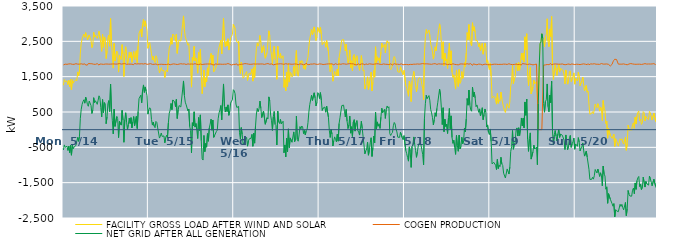
| Category | FACILITY GROSS LOAD AFTER WIND AND SOLAR | COGEN PRODUCTION | NET GRID AFTER ALL GENERATION |
|---|---|---|---|
|  Mon  5/14 | 1258 | 1832 | -574 |
|  Mon  5/14 | 1418 | 1849 | -431 |
|  Mon  5/14 | 1354 | 1854 | -500 |
|  Mon  5/14 | 1352 | 1835 | -483 |
|  Mon  5/14 | 1381 | 1849 | -468 |
|  Mon  5/14 | 1278 | 1864 | -586 |
|  Mon  5/14 | 1394 | 1860 | -466 |
|  Mon  5/14 | 1210 | 1861 | -651 |
|  Mon  5/14 | 1420 | 1863 | -443 |
|  Mon  5/14 | 1128 | 1851 | -723 |
|  Mon  5/14 | 1414 | 1850 | -436 |
|  Mon  5/14 | 1317 | 1854 | -537 |
|  Mon  5/14 | 1361 | 1849 | -488 |
|  Mon  5/14 | 1387 | 1853 | -466 |
|  Mon  5/14 | 1418 | 1867 | -449 |
|  Mon  5/14 | 1382 | 1848 | -466 |
|  Mon  5/14 | 1634 | 1855 | -221 |
|  Mon  5/14 | 1527 | 1856 | -329 |
|  Mon  5/14 | 1658 | 1854 | -196 |
|  Mon  5/14 | 2163 | 1841 | 322 |
|  Mon  5/14 | 2440 | 1864 | 576 |
|  Mon  5/14 | 2573 | 1856 | 717 |
|  Mon  5/14 | 2648 | 1851 | 797 |
|  Mon  5/14 | 2704 | 1858 | 846 |
|  Mon  5/14 | 2612 | 1863 | 749 |
|  Mon  5/14 | 2748 | 1829 | 919 |
|  Mon  5/14 | 2683 | 1849 | 834 |
|  Mon  5/14 | 2538 | 1829 | 709 |
|  Mon  5/14 | 2535 | 1873 | 662 |
|  Mon  5/14 | 2680 | 1870 | 810 |
|  Mon  5/14 | 2660 | 1867 | 793 |
|  Mon  5/14 | 2529 | 1844 | 685 |
|  Mon  5/14 | 2323 | 1865 | 458 |
|  Mon  5/14 | 2403 | 1849 | 554 |
|  Mon  5/14 | 2757 | 1852 | 905 |
|  Mon  5/14 | 2620 | 1854 | 766 |
|  Mon  5/14 | 2667 | 1849 | 818 |
|  Mon  5/14 | 2661 | 1835 | 826 |
|  Mon  5/14 | 2586 | 1869 | 717 |
|  Mon  5/14 | 2674 | 1842 | 832 |
|  Mon  5/14 | 2785 | 1827 | 958 |
|  Mon  5/14 | 2759 | 1858 | 901 |
|  Mon  5/14 | 2479 | 1850 | 629 |
|  Mon  5/14 | 2216 | 1855 | 361 |
|  Mon  5/14 | 2700 | 1847 | 853 |
|  Mon  5/14 | 2331 | 1848 | 483 |
|  Mon  5/14 | 2627 | 1859 | 768 |
|  Mon  5/14 | 2584 | 1857 | 727 |
|  Mon  5/14 | 2014 | 1845 | 169 |
|  Mon  5/14 | 2221 | 1858 | 363 |
|  Mon  5/14 | 2592 | 1859 | 733 |
|  Mon  5/14 | 2677 | 1854 | 823 |
|  Mon  5/14 | 2364 | 1849 | 515 |
|  Mon  5/14 | 3144 | 1855 | 1289 |
|  Mon  5/14 | 2431 | 1865 | 566 |
|  Mon  5/14 | 2110 | 1859 | 251 |
|  Mon  5/14 | 1743 | 1862 | -119 |
|  Mon  5/14 | 2438 | 1860 | 578 |
|  Mon  5/14 | 1942 | 1850 | 92 |
|  Mon  5/14 | 1953 | 1855 | 98 |
|  Mon  5/14 | 2224 | 1852 | 372 |
|  Mon  5/14 | 2172 | 1859 | 313 |
|  Mon  5/14 | 1629 | 1854 | -225 |
|  Mon  5/14 | 2107 | 1871 | 236 |
|  Mon  5/14 | 2078 | 1849 | 229 |
|  Mon  5/14 | 1984 | 1855 | 129 |
|  Mon  5/14 | 2406 | 1860 | 546 |
|  Mon  5/14 | 2131 | 1863 | 268 |
|  Mon  5/14 | 1505 | 1862 | -357 |
|  Mon  5/14 | 2153 | 1870 | 283 |
|  Mon  5/14 | 2346 | 1868 | 478 |
|  Mon  5/14 | 2058 | 1849 | 209 |
|  Mon  5/14 | 1856 | 1856 | 0 |
|  Mon  5/14 | 2003 | 1855 | 148 |
|  Mon  5/14 | 2192 | 1867 | 325 |
|  Mon  5/14 | 2029 | 1854 | 175 |
|  Mon  5/14 | 2195 | 1855 | 340 |
|  Mon  5/14 | 1905 | 1854 | 51 |
|  Mon  5/14 | 2080 | 1860 | 220 |
|  Mon  5/14 | 2211 | 1839 | 372 |
|  Mon  5/14 | 1985 | 1873 | 112 |
|  Mon  5/14 | 1983 | 1853 | 130 |
|  Mon  5/14 | 2234 | 1859 | 375 |
|  Mon  5/14 | 1899 | 1867 | 32 |
|  Mon  5/14 | 2380 | 1864 | 516 |
|  Mon  5/14 | 2730 | 1852 | 878 |
|  Mon  5/14 | 2737 | 1860 | 877 |
|  Mon  5/14 | 2846 | 1871 | 975 |
|  Mon  5/14 | 2626 | 1866 | 760 |
|  Mon  5/14 | 2975 | 1855 | 1120 |
|  Mon  5/14 | 3124 | 1858 | 1266 |
|  Mon  5/14 | 2917 | 1863 | 1054 |
|  Mon  5/14 | 3079 | 1870 | 1209 |
|  Mon  5/14 | 2937 | 1851 | 1086 |
|  Mon  5/14 | 2810 | 1849 | 961 |
|  Mon  5/14 | 2303 | 1864 | 439 |
|  Tue  5/15 | 2420 | 1857 | 563 |
|  Tue  5/15 | 2468 | 1848 | 620 |
|  Tue  5/15 | 2459 | 1869 | 590 |
|  Tue  5/15 | 2158 | 1870 | 288 |
|  Tue  5/15 | 1977 | 1847 | 130 |
|  Tue  5/15 | 2081 | 1868 | 213 |
|  Tue  5/15 | 1952 | 1850 | 102 |
|  Tue  5/15 | 1899 | 1843 | 56 |
|  Tue  5/15 | 2092 | 1859 | 233 |
|  Tue  5/15 | 2037 | 1833 | 204 |
|  Tue  5/15 | 1885 | 1836 | 49 |
|  Tue  5/15 | 1913 | 1862 | 51 |
|  Tue  5/15 | 1610 | 1848 | -238 |
|  Tue  5/15 | 1670 | 1854 | -184 |
|  Tue  5/15 | 1758 | 1852 | -94 |
|  Tue  5/15 | 1669 | 1861 | -192 |
|  Tue  5/15 | 1676 | 1847 | -171 |
|  Tue  5/15 | 1676 | 1853 | -177 |
|  Tue  5/15 | 1474 | 1846 | -372 |
|  Tue  5/15 | 1646 | 1870 | -224 |
|  Tue  5/15 | 1688 | 1844 | -156 |
|  Tue  5/15 | 1635 | 1866 | -231 |
|  Tue  5/15 | 2049 | 1858 | 191 |
|  Tue  5/15 | 2319 | 1852 | 467 |
|  Tue  5/15 | 2389 | 1836 | 553 |
|  Tue  5/15 | 2604 | 1862 | 742 |
|  Tue  5/15 | 2418 | 1852 | 566 |
|  Tue  5/15 | 2706 | 1865 | 841 |
|  Tue  5/15 | 2691 | 1862 | 829 |
|  Tue  5/15 | 2648 | 1858 | 790 |
|  Tue  5/15 | 2504 | 1853 | 651 |
|  Tue  5/15 | 2703 | 1844 | 859 |
|  Tue  5/15 | 2160 | 1844 | 316 |
|  Tue  5/15 | 2410 | 1853 | 557 |
|  Tue  5/15 | 2538 | 1855 | 683 |
|  Tue  5/15 | 2546 | 1855 | 691 |
|  Tue  5/15 | 2509 | 1866 | 643 |
|  Tue  5/15 | 2514 | 1863 | 651 |
|  Tue  5/15 | 2982 | 1858 | 1124 |
|  Tue  5/15 | 3220 | 1841 | 1379 |
|  Tue  5/15 | 2831 | 1862 | 969 |
|  Tue  5/15 | 2636 | 1858 | 778 |
|  Tue  5/15 | 2549 | 1845 | 704 |
|  Tue  5/15 | 2571 | 1852 | 719 |
|  Tue  5/15 | 2391 | 1861 | 530 |
|  Tue  5/15 | 2436 | 1851 | 585 |
|  Tue  5/15 | 1938 | 1853 | 85 |
|  Tue  5/15 | 1836 | 1860 | -24 |
|  Tue  5/15 | 1204 | 1859 | -655 |
|  Tue  5/15 | 2049 | 1852 | 197 |
|  Tue  5/15 | 1963 | 1853 | 110 |
|  Tue  5/15 | 2357 | 1851 | 506 |
|  Tue  5/15 | 1941 | 1868 | 73 |
|  Tue  5/15 | 2027 | 1853 | 174 |
|  Tue  5/15 | 1851 | 1850 | 1 |
|  Tue  5/15 | 1598 | 1848 | -250 |
|  Tue  5/15 | 2185 | 1842 | 343 |
|  Tue  5/15 | 1837 | 1858 | -21 |
|  Tue  5/15 | 2276 | 1858 | 418 |
|  Tue  5/15 | 1541 | 1853 | -312 |
|  Tue  5/15 | 1019 | 1843 | -824 |
|  Tue  5/15 | 1004 | 1864 | -860 |
|  Tue  5/15 | 1688 | 1852 | -164 |
|  Tue  5/15 | 1215 | 1838 | -623 |
|  Tue  5/15 | 1467 | 1856 | -389 |
|  Tue  5/15 | 1355 | 1851 | -496 |
|  Tue  5/15 | 1749 | 1859 | -110 |
|  Tue  5/15 | 1535 | 1863 | -328 |
|  Tue  5/15 | 1904 | 1858 | 46 |
|  Tue  5/15 | 2017 | 1858 | 159 |
|  Tue  5/15 | 2158 | 1860 | 298 |
|  Tue  5/15 | 1837 | 1853 | -16 |
|  Tue  5/15 | 2107 | 1836 | 271 |
|  Tue  5/15 | 1636 | 1853 | -217 |
|  Tue  5/15 | 1669 | 1832 | -163 |
|  Tue  5/15 | 1677 | 1866 | -189 |
|  Tue  5/15 | 1804 | 1855 | -51 |
|  Tue  5/15 | 1836 | 1849 | -13 |
|  Tue  5/15 | 2171 | 1862 | 309 |
|  Tue  5/15 | 2329 | 1855 | 474 |
|  Tue  5/15 | 2427 | 1866 | 561 |
|  Tue  5/15 | 2536 | 1853 | 683 |
|  Tue  5/15 | 2143 | 1863 | 280 |
|  Tue  5/15 | 2706 | 1850 | 856 |
|  Tue  5/15 | 3158 | 1864 | 1294 |
|  Tue  5/15 | 2513 | 1853 | 660 |
|  Tue  5/15 | 2339 | 1840 | 499 |
|  Tue  5/15 | 2497 | 1853 | 644 |
|  Tue  5/15 | 2367 | 1853 | 514 |
|  Tue  5/15 | 2574 | 1872 | 702 |
|  Tue  5/15 | 2253 | 1847 | 406 |
|  Tue  5/15 | 2375 | 1852 | 523 |
|  Tue  5/15 | 2607 | 1855 | 752 |
|  Tue  5/15 | 2638 | 1828 | 810 |
|  Tue  5/15 | 2694 | 1851 | 843 |
|  Tue  5/15 | 2978 | 1847 | 1131 |
|  Wed  5/16 | 2959 | 1857 | 1102 |
|  Wed  5/16 | 2866 | 1848 | 1018 |
|  Wed  5/16 | 2588 | 1863 | 725 |
|  Wed  5/16 | 2489 | 1862 | 627 |
|  Wed  5/16 | 2460 | 1822 | 638 |
|  Wed  5/16 | 2509 | 1849 | 660 |
|  Wed  5/16 | 1760 | 1847 | -87 |
|  Wed  5/16 | 1586 | 1857 | -271 |
|  Wed  5/16 | 1909 | 1850 | 59 |
|  Wed  5/16 | 1718 | 1847 | -129 |
|  Wed  5/16 | 1455 | 1857 | -402 |
|  Wed  5/16 | 1494 | 1861 | -367 |
|  Wed  5/16 | 1537 | 1869 | -332 |
|  Wed  5/16 | 1597 | 1853 | -256 |
|  Wed  5/16 | 1646 | 1865 | -219 |
|  Wed  5/16 | 1393 | 1860 | -467 |
|  Wed  5/16 | 1539 | 1855 | -316 |
|  Wed  5/16 | 1599 | 1859 | -260 |
|  Wed  5/16 | 1561 | 1849 | -288 |
|  Wed  5/16 | 1616 | 1858 | -242 |
|  Wed  5/16 | 1719 | 1853 | -134 |
|  Wed  5/16 | 1374 | 1844 | -470 |
|  Wed  5/16 | 1762 | 1861 | -99 |
|  Wed  5/16 | 1472 | 1854 | -382 |
|  Wed  5/16 | 1961 | 1856 | 105 |
|  Wed  5/16 | 2297 | 1854 | 443 |
|  Wed  5/16 | 2457 | 1859 | 598 |
|  Wed  5/16 | 2365 | 1853 | 512 |
|  Wed  5/16 | 2454 | 1857 | 597 |
|  Wed  5/16 | 2666 | 1857 | 809 |
|  Wed  5/16 | 2462 | 1859 | 603 |
|  Wed  5/16 | 2174 | 1832 | 342 |
|  Wed  5/16 | 2194 | 1859 | 335 |
|  Wed  5/16 | 2376 | 1850 | 526 |
|  Wed  5/16 | 2383 | 1847 | 536 |
|  Wed  5/16 | 2022 | 1869 | 153 |
|  Wed  5/16 | 2037 | 1862 | 175 |
|  Wed  5/16 | 2185 | 1846 | 339 |
|  Wed  5/16 | 2174 | 1871 | 303 |
|  Wed  5/16 | 2798 | 1870 | 928 |
|  Wed  5/16 | 2664 | 1851 | 813 |
|  Wed  5/16 | 2255 | 1843 | 412 |
|  Wed  5/16 | 2114 | 1862 | 252 |
|  Wed  5/16 | 1843 | 1864 | -21 |
|  Wed  5/16 | 2198 | 1834 | 364 |
|  Wed  5/16 | 2361 | 1846 | 515 |
|  Wed  5/16 | 1999 | 1848 | 151 |
|  Wed  5/16 | 1965 | 1852 | 113 |
|  Wed  5/16 | 1426 | 1859 | -433 |
|  Wed  5/16 | 2360 | 1836 | 524 |
|  Wed  5/16 | 2083 | 1860 | 223 |
|  Wed  5/16 | 2025 | 1850 | 175 |
|  Wed  5/16 | 2158 | 1866 | 292 |
|  Wed  5/16 | 2017 | 1854 | 163 |
|  Wed  5/16 | 2020 | 1859 | 161 |
|  Wed  5/16 | 2091 | 1853 | 238 |
|  Wed  5/16 | 1195 | 1850 | -655 |
|  Wed  5/16 | 1417 | 1850 | -433 |
|  Wed  5/16 | 1099 | 1868 | -769 |
|  Wed  5/16 | 1625 | 1865 | -240 |
|  Wed  5/16 | 1225 | 1855 | -630 |
|  Wed  5/16 | 1880 | 1857 | 23 |
|  Wed  5/16 | 1347 | 1860 | -513 |
|  Wed  5/16 | 1630 | 1863 | -233 |
|  Wed  5/16 | 1597 | 1852 | -255 |
|  Wed  5/16 | 1493 | 1848 | -355 |
|  Wed  5/16 | 1523 | 1852 | -329 |
|  Wed  5/16 | 1787 | 1850 | -63 |
|  Wed  5/16 | 1519 | 1860 | -341 |
|  Wed  5/16 | 1541 | 1836 | -295 |
|  Wed  5/16 | 2240 | 1857 | 383 |
|  Wed  5/16 | 1568 | 1846 | -278 |
|  Wed  5/16 | 1512 | 1839 | -327 |
|  Wed  5/16 | 1704 | 1852 | -148 |
|  Wed  5/16 | 1946 | 1862 | 84 |
|  Wed  5/16 | 1879 | 1853 | 26 |
|  Wed  5/16 | 1958 | 1854 | 104 |
|  Wed  5/16 | 1926 | 1851 | 75 |
|  Wed  5/16 | 1728 | 1838 | -110 |
|  Wed  5/16 | 1822 | 1846 | -24 |
|  Wed  5/16 | 1707 | 1853 | -146 |
|  Wed  5/16 | 1859 | 1884 | -25 |
|  Wed  5/16 | 1856 | 1851 | 5 |
|  Wed  5/16 | 2048 | 1849 | 199 |
|  Wed  5/16 | 2338 | 1839 | 499 |
|  Wed  5/16 | 2568 | 1858 | 710 |
|  Wed  5/16 | 2566 | 1856 | 710 |
|  Wed  5/16 | 2836 | 1860 | 976 |
|  Wed  5/16 | 2683 | 1855 | 828 |
|  Wed  5/16 | 2681 | 1845 | 836 |
|  Wed  5/16 | 2908 | 1865 | 1043 |
|  Wed  5/16 | 2755 | 1856 | 899 |
|  Wed  5/16 | 2524 | 1853 | 671 |
|  Wed  5/16 | 2617 | 1847 | 770 |
|  Wed  5/16 | 2895 | 1847 | 1048 |
|  Wed  5/16 | 2868 | 1858 | 1010 |
|  Thu  5/17 | 2744 | 1862 | 882 |
|  Thu  5/17 | 2896 | 1848 | 1048 |
|  Thu  5/17 | 2696 | 1857 | 839 |
|  Thu  5/17 | 2405 | 1861 | 544 |
|  Thu  5/17 | 2455 | 1844 | 611 |
|  Thu  5/17 | 2476 | 1863 | 613 |
|  Thu  5/17 | 2491 | 1850 | 641 |
|  Thu  5/17 | 2334 | 1841 | 493 |
|  Thu  5/17 | 2523 | 1857 | 666 |
|  Thu  5/17 | 2514 | 1850 | 664 |
|  Thu  5/17 | 2213 | 1862 | 351 |
|  Thu  5/17 | 1828 | 1846 | -18 |
|  Thu  5/17 | 1642 | 1862 | -220 |
|  Thu  5/17 | 1863 | 1857 | 6 |
|  Thu  5/17 | 1737 | 1862 | -125 |
|  Thu  5/17 | 1372 | 1834 | -462 |
|  Thu  5/17 | 1525 | 1836 | -311 |
|  Thu  5/17 | 1648 | 1852 | -204 |
|  Thu  5/17 | 1588 | 1867 | -279 |
|  Thu  5/17 | 1523 | 1866 | -343 |
|  Thu  5/17 | 1715 | 1845 | -130 |
|  Thu  5/17 | 1520 | 1846 | -326 |
|  Thu  5/17 | 2035 | 1860 | 175 |
|  Thu  5/17 | 2193 | 1851 | 342 |
|  Thu  5/17 | 2181 | 1850 | 331 |
|  Thu  5/17 | 2539 | 1858 | 681 |
|  Thu  5/17 | 2533 | 1865 | 668 |
|  Thu  5/17 | 2549 | 1854 | 695 |
|  Thu  5/17 | 2384 | 1861 | 523 |
|  Thu  5/17 | 2227 | 1865 | 362 |
|  Thu  5/17 | 2423 | 1851 | 572 |
|  Thu  5/17 | 2094 | 1858 | 236 |
|  Thu  5/17 | 1892 | 1862 | 30 |
|  Thu  5/17 | 1971 | 1838 | 133 |
|  Thu  5/17 | 2251 | 1868 | 383 |
|  Thu  5/17 | 1747 | 1846 | -99 |
|  Thu  5/17 | 1948 | 1865 | 83 |
|  Thu  5/17 | 1664 | 1855 | -191 |
|  Thu  5/17 | 2080 | 1862 | 218 |
|  Thu  5/17 | 2131 | 1847 | 284 |
|  Thu  5/17 | 1800 | 1841 | -41 |
|  Thu  5/17 | 2033 | 1841 | 192 |
|  Thu  5/17 | 2092 | 1835 | 257 |
|  Thu  5/17 | 1842 | 1859 | -17 |
|  Thu  5/17 | 1795 | 1866 | -71 |
|  Thu  5/17 | 1680 | 1833 | -153 |
|  Thu  5/17 | 1885 | 1847 | 38 |
|  Thu  5/17 | 2097 | 1860 | 237 |
|  Thu  5/17 | 1881 | 1847 | 34 |
|  Thu  5/17 | 1659 | 1861 | -202 |
|  Thu  5/17 | 1690 | 1867 | -177 |
|  Thu  5/17 | 1151 | 1834 | -683 |
|  Thu  5/17 | 1262 | 1863 | -601 |
|  Thu  5/17 | 1307 | 1855 | -548 |
|  Thu  5/17 | 1495 | 1846 | -351 |
|  Thu  5/17 | 1136 | 1859 | -723 |
|  Thu  5/17 | 1284 | 1864 | -580 |
|  Thu  5/17 | 1493 | 1865 | -372 |
|  Thu  5/17 | 1628 | 1857 | -229 |
|  Thu  5/17 | 1100 | 1858 | -758 |
|  Thu  5/17 | 1342 | 1850 | -508 |
|  Thu  5/17 | 1677 | 1857 | -180 |
|  Thu  5/17 | 1485 | 1856 | -371 |
|  Thu  5/17 | 2345 | 1852 | 493 |
|  Thu  5/17 | 1887 | 1865 | 22 |
|  Thu  5/17 | 2062 | 1842 | 220 |
|  Thu  5/17 | 1962 | 1864 | 98 |
|  Thu  5/17 | 2033 | 1868 | 165 |
|  Thu  5/17 | 1885 | 1851 | 34 |
|  Thu  5/17 | 2201 | 1848 | 353 |
|  Thu  5/17 | 2451 | 1845 | 606 |
|  Thu  5/17 | 2329 | 1852 | 477 |
|  Thu  5/17 | 2346 | 1861 | 485 |
|  Thu  5/17 | 2412 | 1836 | 576 |
|  Thu  5/17 | 2169 | 1851 | 318 |
|  Thu  5/17 | 2427 | 1854 | 573 |
|  Thu  5/17 | 2520 | 1849 | 671 |
|  Thu  5/17 | 2455 | 1839 | 616 |
|  Thu  5/17 | 2489 | 1841 | 648 |
|  Thu  5/17 | 1737 | 1849 | -112 |
|  Thu  5/17 | 1698 | 1862 | -164 |
|  Thu  5/17 | 1737 | 1848 | -111 |
|  Thu  5/17 | 1754 | 1833 | -79 |
|  Thu  5/17 | 1965 | 1854 | 111 |
|  Thu  5/17 | 2070 | 1867 | 203 |
|  Thu  5/17 | 2012 | 1851 | 161 |
|  Thu  5/17 | 1863 | 1852 | 11 |
|  Thu  5/17 | 1810 | 1874 | -64 |
|  Thu  5/17 | 1639 | 1852 | -213 |
|  Thu  5/17 | 1612 | 1846 | -234 |
|  Thu  5/17 | 1625 | 1844 | -219 |
|  Thu  5/17 | 1780 | 1853 | -73 |
|  Thu  5/17 | 1803 | 1863 | -60 |
|  Thu  5/17 | 1615 | 1844 | -229 |
|  Thu  5/17 | 1551 | 1837 | -286 |
|  Thu  5/17 | 1680 | 1848 | -168 |
|  Fri  5/18 | 1682 | 1846 | -164 |
|  Fri  5/18 | 1248 | 1839 | -591 |
|  Fri  5/18 | 1168 | 1845 | -677 |
|  Fri  5/18 | 1067 | 1854 | -787 |
|  Fri  5/18 | 947 | 1838 | -891 |
|  Fri  5/18 | 1374 | 1860 | -486 |
|  Fri  5/18 | 1227 | 1848 | -621 |
|  Fri  5/18 | 795 | 1863 | -1068 |
|  Fri  5/18 | 1373 | 1845 | -472 |
|  Fri  5/18 | 1397 | 1831 | -434 |
|  Fri  5/18 | 1648 | 1854 | -206 |
|  Fri  5/18 | 1442 | 1857 | -415 |
|  Fri  5/18 | 1267 | 1852 | -585 |
|  Fri  5/18 | 1070 | 1852 | -782 |
|  Fri  5/18 | 1231 | 1860 | -629 |
|  Fri  5/18 | 1413 | 1876 | -463 |
|  Fri  5/18 | 1469 | 1854 | -385 |
|  Fri  5/18 | 1467 | 1863 | -396 |
|  Fri  5/18 | 1441 | 1861 | -420 |
|  Fri  5/18 | 1280 | 1846 | -566 |
|  Fri  5/18 | 1172 | 1870 | -698 |
|  Fri  5/18 | 849 | 1845 | -996 |
|  Fri  5/18 | 2183 | 1862 | 321 |
|  Fri  5/18 | 2607 | 1874 | 733 |
|  Fri  5/18 | 2834 | 1863 | 971 |
|  Fri  5/18 | 2725 | 1845 | 880 |
|  Fri  5/18 | 2758 | 1860 | 898 |
|  Fri  5/18 | 2820 | 1856 | 964 |
|  Fri  5/18 | 2688 | 1855 | 833 |
|  Fri  5/18 | 2422 | 1852 | 570 |
|  Fri  5/18 | 2325 | 1850 | 475 |
|  Fri  5/18 | 2199 | 1855 | 344 |
|  Fri  5/18 | 1997 | 1863 | 134 |
|  Fri  5/18 | 2142 | 1855 | 287 |
|  Fri  5/18 | 2346 | 1868 | 478 |
|  Fri  5/18 | 2231 | 1854 | 377 |
|  Fri  5/18 | 2450 | 1847 | 603 |
|  Fri  5/18 | 2635 | 1859 | 776 |
|  Fri  5/18 | 2629 | 1863 | 766 |
|  Fri  5/18 | 2995 | 1849 | 1146 |
|  Fri  5/18 | 2840 | 1858 | 982 |
|  Fri  5/18 | 2471 | 1854 | 617 |
|  Fri  5/18 | 1998 | 1855 | 143 |
|  Fri  5/18 | 2487 | 1866 | 621 |
|  Fri  5/18 | 1808 | 1864 | -56 |
|  Fri  5/18 | 2166 | 1869 | 297 |
|  Fri  5/18 | 1948 | 1859 | 89 |
|  Fri  5/18 | 2003 | 1848 | 155 |
|  Fri  5/18 | 1735 | 1841 | -106 |
|  Fri  5/18 | 2204 | 1864 | 340 |
|  Fri  5/18 | 2452 | 1851 | 601 |
|  Fri  5/18 | 1865 | 1838 | 27 |
|  Fri  5/18 | 2232 | 1842 | 390 |
|  Fri  5/18 | 1630 | 1852 | -222 |
|  Fri  5/18 | 1479 | 1865 | -386 |
|  Fri  5/18 | 1550 | 1853 | -303 |
|  Fri  5/18 | 1345 | 1848 | -503 |
|  Fri  5/18 | 1149 | 1848 | -699 |
|  Fri  5/18 | 1679 | 1842 | -163 |
|  Fri  5/18 | 1398 | 1852 | -454 |
|  Fri  5/18 | 1222 | 1834 | -612 |
|  Fri  5/18 | 1705 | 1859 | -154 |
|  Fri  5/18 | 1311 | 1858 | -547 |
|  Fri  5/18 | 1357 | 1840 | -483 |
|  Fri  5/18 | 1644 | 1859 | -215 |
|  Fri  5/18 | 1452 | 1850 | -398 |
|  Fri  5/18 | 1543 | 1856 | -313 |
|  Fri  5/18 | 1901 | 1853 | 48 |
|  Fri  5/18 | 1789 | 1853 | -64 |
|  Fri  5/18 | 2168 | 1865 | 303 |
|  Fri  5/18 | 2748 | 1866 | 882 |
|  Fri  5/18 | 2539 | 1847 | 692 |
|  Fri  5/18 | 2974 | 1854 | 1120 |
|  Fri  5/18 | 2551 | 1847 | 704 |
|  Fri  5/18 | 2430 | 1869 | 561 |
|  Fri  5/18 | 2372 | 1850 | 522 |
|  Fri  5/18 | 3026 | 1820 | 1206 |
|  Fri  5/18 | 2796 | 1862 | 934 |
|  Fri  5/18 | 2914 | 1852 | 1062 |
|  Fri  5/18 | 2748 | 1848 | 900 |
|  Fri  5/18 | 2506 | 1856 | 650 |
|  Fri  5/18 | 2536 | 1836 | 700 |
|  Fri  5/18 | 2455 | 1850 | 605 |
|  Fri  5/18 | 2349 | 1856 | 493 |
|  Fri  5/18 | 2436 | 1848 | 588 |
|  Fri  5/18 | 2239 | 1851 | 388 |
|  Fri  5/18 | 2366 | 1865 | 501 |
|  Fri  5/18 | 2451 | 1830 | 621 |
|  Fri  5/18 | 2137 | 1855 | 282 |
|  Fri  5/18 | 2274 | 1849 | 425 |
|  Fri  5/18 | 2450 | 1864 | 586 |
|  Fri  5/18 | 2348 | 1853 | 495 |
|  Fri  5/18 | 1905 | 1830 | 75 |
|  Fri  5/18 | 1974 | 1840 | 134 |
|  Fri  5/18 | 1787 | 1868 | -81 |
|  Fri  5/18 | 1698 | 1839 | -141 |
|  Sat  5/19 | 1880 | 1860 | 20 |
|  Sat  5/19 | 1503 | 1837 | -334 |
|  Sat  5/19 | 890 | 1857 | -967 |
|  Sat  5/19 | 885 | 1849 | -964 |
|  Sat  5/19 | 947 | 1872 | -925 |
|  Sat  5/19 | 915 | 1854 | -939 |
|  Sat  5/19 | 830 | 1837 | -1007 |
|  Sat  5/19 | 722 | 1851 | -1129 |
|  Sat  5/19 | 1025 | 1864 | -839 |
|  Sat  5/19 | 745 | 1846 | -1101 |
|  Sat  5/19 | 841 | 1850 | -1009 |
|  Sat  5/19 | 807 | 1849 | -1042 |
|  Sat  5/19 | 1065 | 1845 | -780 |
|  Sat  5/19 | 875 | 1847 | -972 |
|  Sat  5/19 | 848 | 1862 | -1014 |
|  Sat  5/19 | 625 | 1855 | -1230 |
|  Sat  5/19 | 610 | 1842 | -1232 |
|  Sat  5/19 | 487 | 1854 | -1367 |
|  Sat  5/19 | 498 | 1852 | -1354 |
|  Sat  5/19 | 735 | 1846 | -1111 |
|  Sat  5/19 | 746 | 1865 | -1119 |
|  Sat  5/19 | 610 | 1866 | -1256 |
|  Sat  5/19 | 785 | 1846 | -1061 |
|  Sat  5/19 | 1230 | 1847 | -617 |
|  Sat  5/19 | 1373 | 1853 | -480 |
|  Sat  5/19 | 1818 | 1842 | -24 |
|  Sat  5/19 | 1305 | 1859 | -554 |
|  Sat  5/19 | 1426 | 1846 | -420 |
|  Sat  5/19 | 1484 | 1840 | -356 |
|  Sat  5/19 | 1832 | 1856 | -24 |
|  Sat  5/19 | 1887 | 1838 | 49 |
|  Sat  5/19 | 1661 | 1840 | -179 |
|  Sat  5/19 | 1899 | 1844 | 55 |
|  Sat  5/19 | 1681 | 1847 | -166 |
|  Sat  5/19 | 1883 | 1850 | 33 |
|  Sat  5/19 | 2160 | 1829 | 331 |
|  Sat  5/19 | 1977 | 1871 | 106 |
|  Sat  5/19 | 2171 | 1846 | 325 |
|  Sat  5/19 | 1913 | 1863 | 50 |
|  Sat  5/19 | 2629 | 1845 | 784 |
|  Sat  5/19 | 2260 | 1855 | 405 |
|  Sat  5/19 | 2715 | 1849 | 866 |
|  Sat  5/19 | 1577 | 1844 | -267 |
|  Sat  5/19 | 1243 | 1857 | -614 |
|  Sat  5/19 | 1601 | 1857 | -256 |
|  Sat  5/19 | 1762 | 1853 | -91 |
|  Sat  5/19 | 1014 | 1847 | -833 |
|  Sat  5/19 | 1013 | 1871 | -858 |
|  Sat  5/19 | 1207 | 1834 | -627 |
|  Sat  5/19 | 1400 | 1837 | -437 |
|  Sat  5/19 | 1296 | 1844 | -548 |
|  Sat  5/19 | 1306 | 1851 | -545 |
|  Sat  5/19 | 1363 | 1857 | -494 |
|  Sat  5/19 | 849 | 1840 | -991 |
|  Sat  5/19 | 728 | 0 | 728 |
|  Sat  5/19 | 1772 | 0 | 1772 |
|  Sat  5/19 | 2433 | 0 | 2433 |
|  Sat  5/19 | 2481 | 0 | 2481 |
|  Sat  5/19 | 2714 | 0 | 2714 |
|  Sat  5/19 | 2584 | 0 | 2584 |
|  Sat  5/19 | 2566 | 1826 | 740 |
|  Sat  5/19 | 2348 | 1854 | 494 |
|  Sat  5/19 | 2631 | 1833 | 798 |
|  Sat  5/19 | 2696 | 1850 | 846 |
|  Sat  5/19 | 3138 | 1844 | 1294 |
|  Sat  5/19 | 2505 | 1856 | 649 |
|  Sat  5/19 | 2347 | 1840 | 507 |
|  Sat  5/19 | 2844 | 1866 | 978 |
|  Sat  5/19 | 2636 | 1872 | 764 |
|  Sat  5/19 | 3205 | 1835 | 1370 |
|  Sat  5/19 | 1783 | 1840 | -57 |
|  Sat  5/19 | 1422 | 1854 | -432 |
|  Sat  5/19 | 1686 | 1831 | -145 |
|  Sat  5/19 | 1835 | 1860 | -25 |
|  Sat  5/19 | 1686 | 1866 | -180 |
|  Sat  5/19 | 1536 | 1856 | -320 |
|  Sat  5/19 | 1737 | 1860 | -123 |
|  Sat  5/19 | 1857 | 1853 | 4 |
|  Sat  5/19 | 1633 | 1851 | -218 |
|  Sat  5/19 | 1729 | 1853 | -124 |
|  Sat  5/19 | 1731 | 1856 | -125 |
|  Sat  5/19 | 1702 | 1860 | -158 |
|  Sat  5/19 | 1662 | 1838 | -176 |
|  Sat  5/19 | 1546 | 1842 | -296 |
|  Sat  5/19 | 1296 | 1858 | -562 |
|  Sat  5/19 | 1690 | 1840 | -150 |
|  Sat  5/19 | 1500 | 1860 | -360 |
|  Sat  5/19 | 1288 | 1854 | -566 |
|  Sat  5/19 | 1399 | 1865 | -466 |
|  Sat  5/19 | 1629 | 1859 | -230 |
|  Sat  5/19 | 1665 | 1829 | -164 |
|  Sat  5/19 | 1360 | 1860 | -500 |
|  Sat  5/19 | 1431 | 1835 | -404 |
|  Sat  5/19 | 1512 | 1855 | -343 |
|  Sat  5/19 | 1607 | 1846 | -239 |
|  Sat  5/19 | 1288 | 1842 | -554 |
|  Sun  5/20 | 1443 | 1847 | -404 |
|  Sun  5/20 | 1450 | 1852 | -402 |
|  Sun  5/20 | 1380 | 1851 | -471 |
|  Sun  5/20 | 1624 | 1849 | -225 |
|  Sun  5/20 | 1498 | 1848 | -350 |
|  Sun  5/20 | 1243 | 1842 | -599 |
|  Sun  5/20 | 1318 | 1847 | -529 |
|  Sun  5/20 | 1382 | 1853 | -471 |
|  Sun  5/20 | 1490 | 1866 | -376 |
|  Sun  5/20 | 1280 | 1862 | -582 |
|  Sun  5/20 | 1101 | 1849 | -748 |
|  Sun  5/20 | 1119 | 1852 | -733 |
|  Sun  5/20 | 1251 | 1858 | -607 |
|  Sun  5/20 | 1060 | 1839 | -779 |
|  Sun  5/20 | 1090 | 1869 | -779 |
|  Sun  5/20 | 714 | 1836 | -1122 |
|  Sun  5/20 | 437 | 1844 | -1407 |
|  Sun  5/20 | 453 | 1862 | -1409 |
|  Sun  5/20 | 462 | 1868 | -1406 |
|  Sun  5/20 | 509 | 1857 | -1348 |
|  Sun  5/20 | 447 | 1847 | -1400 |
|  Sun  5/20 | 563 | 1866 | -1303 |
|  Sun  5/20 | 726 | 1853 | -1127 |
|  Sun  5/20 | 709 | 1852 | -1143 |
|  Sun  5/20 | 618 | 1845 | -1227 |
|  Sun  5/20 | 737 | 1852 | -1115 |
|  Sun  5/20 | 651 | 1866 | -1215 |
|  Sun  5/20 | 524 | 1848 | -1324 |
|  Sun  5/20 | 641 | 1861 | -1220 |
|  Sun  5/20 | 585 | 1872 | -1287 |
|  Sun  5/20 | 257 | 1847 | -1590 |
|  Sun  5/20 | 825 | 1855 | -1030 |
|  Sun  5/20 | 593 | 1846 | -1253 |
|  Sun  5/20 | 543 | 1856 | -1313 |
|  Sun  5/20 | 172 | 1856 | -1684 |
|  Sun  5/20 | 241 | 1860 | -1619 |
|  Sun  5/20 | -242 | 1841 | -2083 |
|  Sun  5/20 | 37 | 1848 | -1811 |
|  Sun  5/20 | 21 | 1849 | -1828 |
|  Sun  5/20 | -167 | 1802 | -1969 |
|  Sun  5/20 | -168 | 1806 | -1974 |
|  Sun  5/20 | -245 | 1850 | -2095 |
|  Sun  5/20 | -248 | 1919 | -2167 |
|  Sun  5/20 | -128 | 1964 | -2092 |
|  Sun  5/20 | -473 | 1993 | -2466 |
|  Sun  5/20 | -257 | 2009 | -2266 |
|  Sun  5/20 | -311 | 1986 | -2297 |
|  Sun  5/20 | -295 | 2001 | -2296 |
|  Sun  5/20 | -467 | 1855 | -2322 |
|  Sun  5/20 | -483 | 1844 | -2327 |
|  Sun  5/20 | -258 | 1854 | -2112 |
|  Sun  5/20 | -295 | 1878 | -2173 |
|  Sun  5/20 | -260 | 1854 | -2114 |
|  Sun  5/20 | -351 | 1855 | -2206 |
|  Sun  5/20 | -409 | 1861 | -2270 |
|  Sun  5/20 | -417 | 1855 | -2272 |
|  Sun  5/20 | -213 | 1847 | -2060 |
|  Sun  5/20 | -584 | 1851 | -2435 |
|  Sun  5/20 | -400 | 1837 | -2237 |
|  Sun  5/20 | 129 | 1850 | -1721 |
|  Sun  5/20 | 29 | 1858 | -1829 |
|  Sun  5/20 | -27 | 1850 | -1877 |
|  Sun  5/20 | 17 | 1871 | -1854 |
|  Sun  5/20 | -17 | 1866 | -1883 |
|  Sun  5/20 | 145 | 1860 | -1715 |
|  Sun  5/20 | 194 | 1848 | -1654 |
|  Sun  5/20 | 39 | 1852 | -1813 |
|  Sun  5/20 | 355 | 1863 | -1508 |
|  Sun  5/20 | 161 | 1850 | -1689 |
|  Sun  5/20 | 399 | 1841 | -1442 |
|  Sun  5/20 | 490 | 1853 | -1363 |
|  Sun  5/20 | 530 | 1855 | -1325 |
|  Sun  5/20 | 244 | 1853 | -1609 |
|  Sun  5/20 | 298 | 1836 | -1538 |
|  Sun  5/20 | 149 | 1846 | -1697 |
|  Sun  5/20 | 194 | 1847 | -1653 |
|  Sun  5/20 | 511 | 1855 | -1344 |
|  Sun  5/20 | 482 | 1851 | -1369 |
|  Sun  5/20 | 245 | 1869 | -1624 |
|  Sun  5/20 | 375 | 1841 | -1466 |
|  Sun  5/20 | 323 | 1856 | -1533 |
|  Sun  5/20 | 303 | 1850 | -1547 |
|  Sun  5/20 | 289 | 1859 | -1570 |
|  Sun  5/20 | 519 | 1835 | -1316 |
|  Sun  5/20 | 470 | 1858 | -1388 |
|  Sun  5/20 | 491 | 1862 | -1371 |
|  Sun  5/20 | 272 | 1860 | -1588 |
|  Sun  5/20 | 275 | 1871 | -1596 |
|  Sun  5/20 | 466 | 1869 | -1403 |
|  Sun  5/20 | 462 | 1848 | -1386 |
|  Sun  5/20 | 233 | 1840 | -1607 |
|  Sun  5/20 | 197 | 1857 | -1660 |